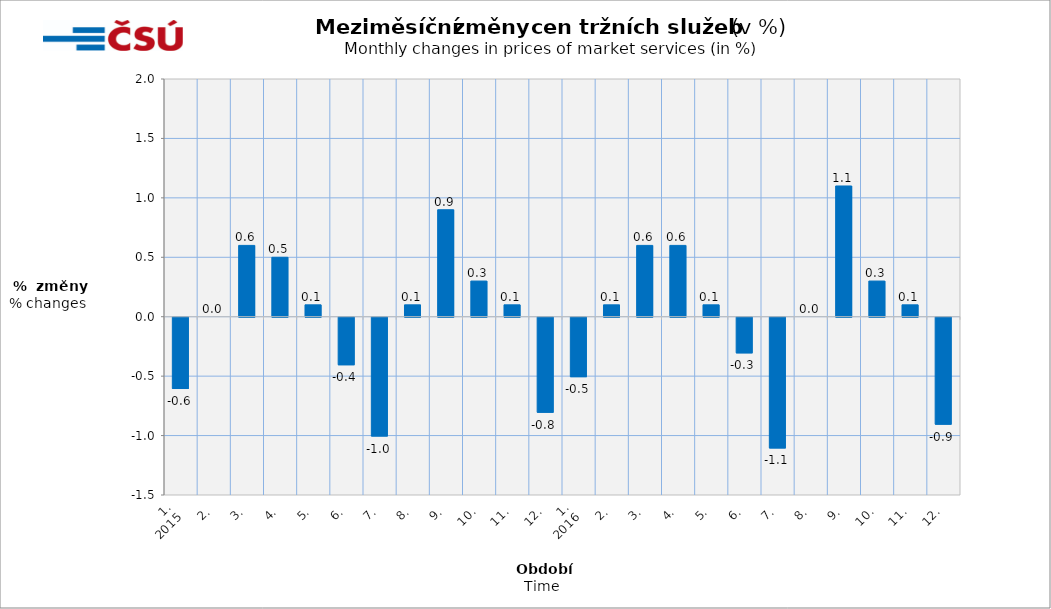
| Category | Meziměsíční změny v % |
|---|---|
| 0 | -0.6 |
| 1 | 0 |
| 2 | 0.6 |
| 3 | 0.5 |
| 4 | 0.1 |
| 5 | -0.4 |
| 6 | -1 |
| 7 | 0.1 |
| 8 | 0.9 |
| 9 | 0.3 |
| 10 | 0.1 |
| 11 | -0.8 |
| 12 | -0.5 |
| 13 | 0.1 |
| 14 | 0.6 |
| 15 | 0.6 |
| 16 | 0.1 |
| 17 | -0.3 |
| 18 | -1.1 |
| 19 | 0 |
| 20 | 1.1 |
| 21 | 0.3 |
| 22 | 0.1 |
| 23 | -0.9 |